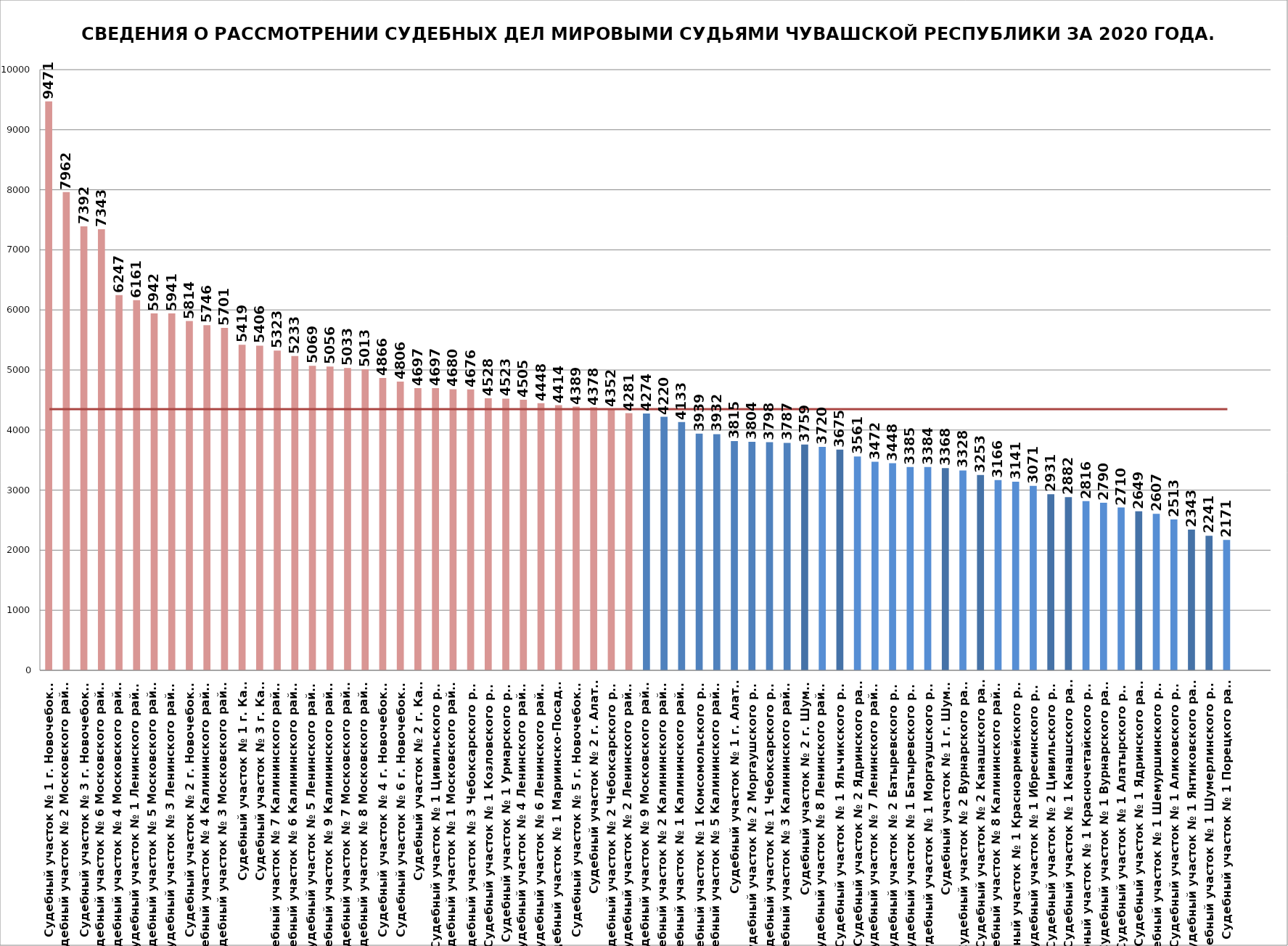
| Category | Общее кол-во рассмотренных дел |
|---|---|
| Судебный участок № 1 г. Новочебоксарск | 9471 |
| Судебный участок № 2 Московского района г. Чебоксары | 7962 |
| Судебный участок № 3 г. Новочебоксарск | 7392 |
| Судебный участок № 6 Московского района г. Чебоксары | 7343 |
| Судебный участок № 4 Московского района г. Чебоксары | 6247 |
| Судебный участок № 1 Ленинского района г. Чебоксары | 6161 |
| Судебный участок № 5 Московского района г. Чебоксары | 5942 |
| Судебный участок № 3 Ленинского района г. Чебоксары | 5941 |
| Судебный участок № 2 г. Новочебоксарск | 5814 |
| Судебный участок № 4 Калининского района г. Чебоксары | 5746 |
| Судебный участок № 3 Московского района г. Чебоксары | 5701 |
| Судебный участок № 1 г. Канаш | 5419 |
| Судебный участок № 3 г. Канаш | 5406 |
| Судебный участок № 7 Калининского района г. Чебоксары | 5323 |
| Судебный участок № 6 Калининского района г. Чебоксары | 5233 |
| Судебный участок № 5 Ленинского района г. Чебоксары | 5069 |
| Судебный участок № 9 Калининского района г. Чебоксары | 5056 |
| Судебный участок № 7 Московского района г. Чебоксары | 5033 |
| Судебный участок № 8 Московского района г. Чебоксары | 5013 |
| Судебный участок № 4 г. Новочебоксарск | 4866 |
| Судебный участок № 6 г. Новочебоксарск | 4806 |
| Судебный участок № 2 г. Канаш | 4697 |
| Судебный участок № 1 Цивильского района | 4697 |
| Судебный участок № 1 Московского района г. Чебоксары | 4680 |
| Судебный участок № 3 Чебоксарского района | 4676 |
| Судебный участок № 1 Козловского района | 4528 |
| Судебный участок № 1 Урмарского района | 4523 |
| Судебный участок № 4 Ленинского района г. Чебоксары | 4505 |
| Судебный участок № 6 Ленинского района г. Чебоксары | 4448 |
| Судебный участок № 1 Мариинско-Посадского района | 4414 |
| Судебный участок № 5 г. Новочебоксарск | 4389 |
| Судебный участок № 2 г. Алатырь | 4378 |
| Судебный участок № 2 Чебоксарского района | 4352 |
| Судебный участок № 2 Ленинского района г. Чебоксары | 4281 |
| Судебный участок № 9 Московского района г. Чебоксары | 4274 |
| Судебный участок № 2 Калининского района г. Чебоксары | 4220 |
| Судебный участок № 1 Калининского района г. Чебоксары | 4133 |
| Судебный участок № 1 Комсомольского района | 3939 |
| Судебный участок № 5 Калининского района г. Чебоксары | 3932 |
| Судебный участок № 1 г. Алатырь | 3815 |
| Судебный участок № 2 Моргаушского района | 3804 |
| Судебный участок № 1 Чебоксарского района | 3798 |
| Судебный участок № 3 Калининского района г. Чебоксары | 3787 |
| Судебный участок № 2 г. Шумерля | 3759 |
| Судебный участок № 8 Ленинского района г. Чебоксары | 3720 |
| Судебный участок № 1 Яльчикского района | 3675 |
| Судебный участок № 2 Ядринского района | 3561 |
| Судебный участок № 7 Ленинского района г. Чебоксары | 3472 |
| Судебный участок № 2 Батыревского района | 3448 |
| Судебный участок № 1 Батыревского района | 3385 |
| Судебный участок № 1 Моргаушского района | 3384 |
| Судебный участок № 1 г. Шумерля | 3368 |
| Судебный участок № 2 Вурнарского района | 3328 |
| Судебный участок № 2 Канашского района | 3253 |
| Судебный участок № 8 Калининского района г. Чебоксары | 3166 |
| Судебный участок № 1 Красноармейского района | 3141 |
| Судебный участок № 1 Ибресинского района | 3071 |
| Судебный участок № 2 Цивильского района | 2931 |
| Судебный участок № 1 Канашского района | 2882 |
| Судебный участок № 1 Красночетайского района | 2816 |
| Судебный участок № 1 Вурнарского района | 2790 |
| Судебный участок № 1 Алатырского района | 2710 |
| Судебный участок № 1 Ядринского района | 2649 |
| Судебный участок № 1 Шемуршинского района | 2607 |
| Судебный участок № 1 Аликовского района | 2513 |
| Судебный участок № 1 Янтиковского района | 2343 |
| Судебный участок № 1 Шумерлинского района | 2241 |
| Судебный участок № 1 Порецкого района | 2171 |